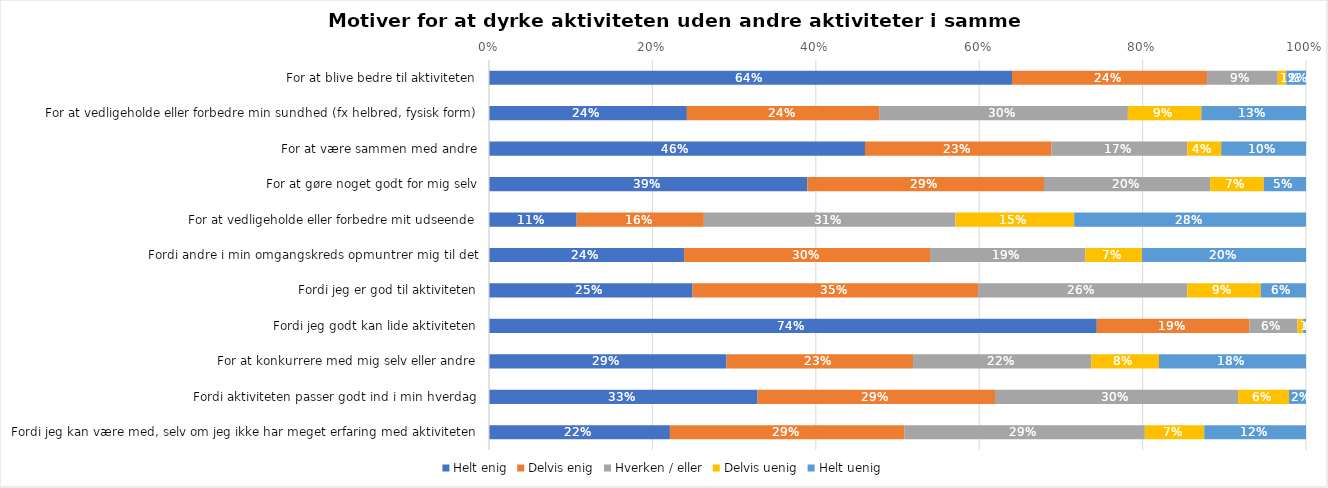
| Category | Helt enig | Delvis enig | Hverken / eller | Delvis uenig | Helt uenig |
|---|---|---|---|---|---|
| For at blive bedre til aktiviteten | 0.64 | 0.239 | 0.087 | 0.01 | 0.024 |
| For at vedligeholde eller forbedre min sundhed (fx helbred, fysisk form) | 0.242 | 0.235 | 0.304 | 0.09 | 0.128 |
| For at være sammen med andre | 0.46 | 0.228 | 0.166 | 0.042 | 0.104 |
| For at gøre noget godt for mig selv | 0.39 | 0.29 | 0.203 | 0.066 | 0.052 |
| For at vedligeholde eller forbedre mit udseende | 0.107 | 0.156 | 0.308 | 0.145 | 0.284 |
| Fordi andre i min omgangskreds opmuntrer mig til det | 0.239 | 0.301 | 0.19 | 0.069 | 0.201 |
| Fordi jeg er god til aktiviteten | 0.249 | 0.349 | 0.256 | 0.09 | 0.055 |
| Fordi jeg godt kan lide aktiviteten | 0.744 | 0.187 | 0.059 | 0.007 | 0.003 |
| For at konkurrere med mig selv eller andre | 0.291 | 0.228 | 0.218 | 0.083 | 0.18 |
| Fordi aktiviteten passer godt ind i min hverdag | 0.329 | 0.291 | 0.298 | 0.062 | 0.021 |
| Fordi jeg kan være med, selv om jeg ikke har meget erfaring med aktiviteten | 0.221 | 0.287 | 0.294 | 0.073 | 0.125 |